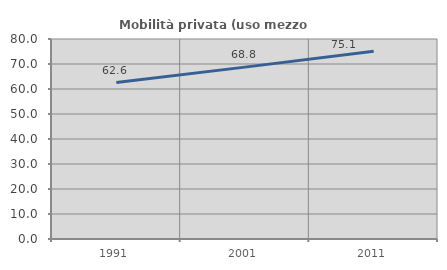
| Category | Mobilità privata (uso mezzo privato) |
|---|---|
| 1991.0 | 62.571 |
| 2001.0 | 68.754 |
| 2011.0 | 75.093 |